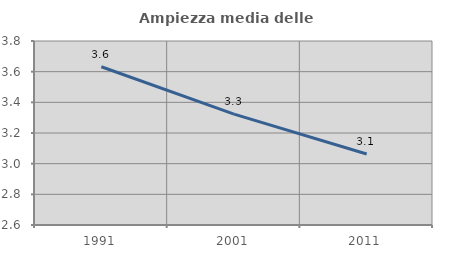
| Category | Ampiezza media delle famiglie |
|---|---|
| 1991.0 | 3.632 |
| 2001.0 | 3.323 |
| 2011.0 | 3.063 |